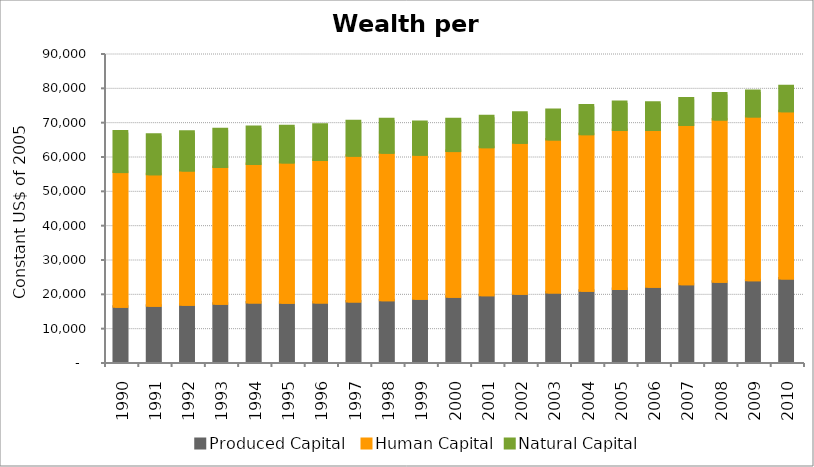
| Category | Produced Capital  | Human Capital | Natural Capital |
|---|---|---|---|
| 1990.0 | 16126.71 | 39178.668 | 11821.9 |
| 1991.0 | 16369.333 | 38301.764 | 11546.205 |
| 1992.0 | 16710.36 | 39053.892 | 11283.527 |
| 1993.0 | 16984.653 | 39806.539 | 11030.553 |
| 1994.0 | 17329.048 | 40354.473 | 10786.085 |
| 1995.0 | 17263.598 | 40871.778 | 10546.425 |
| 1996.0 | 17337.601 | 41491.144 | 10281.416 |
| 1997.0 | 17611.334 | 42497.343 | 10022.223 |
| 1998.0 | 17983.937 | 42975.257 | 9753.053 |
| 1999.0 | 18430.397 | 41955.215 | 9494.731 |
| 2000.0 | 19007.459 | 42416.062 | 9248.33 |
| 2001.0 | 19462.116 | 43101.804 | 9016.887 |
| 2002.0 | 19879.999 | 43956.225 | 8792.338 |
| 2003.0 | 20273.399 | 44557.435 | 8577.45 |
| 2004.0 | 20743.752 | 45620.485 | 8368.301 |
| 2005.0 | 21279.423 | 46329.21 | 8152.647 |
| 2006.0 | 21919.157 | 45668.386 | 7927.228 |
| 2007.0 | 22619.972 | 46417.474 | 7743.638 |
| 2008.0 | 23367.218 | 47254.96 | 7592.65 |
| 2009.0 | 23840.334 | 47690.615 | 7424.125 |
| 2010.0 | 24314.542 | 48713.635 | 7268.317 |